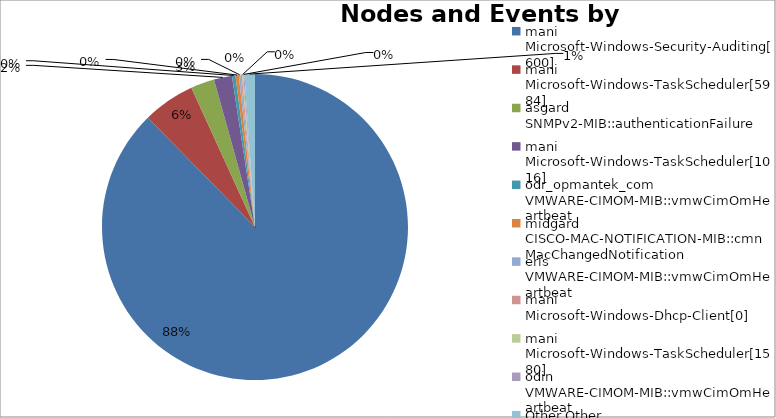
| Category | Series 0 |
|---|---|
| 0 | 137182 |
| 1 | 8632 |
| 2 | 3917 |
| 3 | 2989 |
| 4 | 570 |
| 5 | 554 |
| 6 | 287 |
| 7 | 245 |
| 8 | 195 |
| 9 | 193 |
| 10 | 1730 |